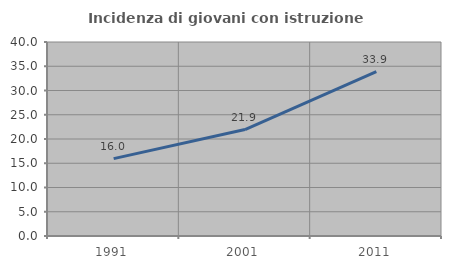
| Category | Incidenza di giovani con istruzione universitaria |
|---|---|
| 1991.0 | 15.953 |
| 2001.0 | 21.946 |
| 2011.0 | 33.89 |